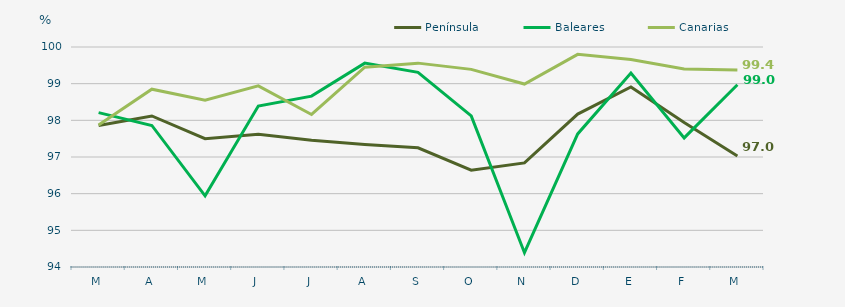
| Category | Península | Baleares | Canarias |
|---|---|---|---|
| M | 97.86 | 98.21 | 97.87 |
| A | 98.12 | 97.86 | 98.85 |
| M | 97.5 | 95.94 | 98.55 |
| J | 97.62 | 98.39 | 98.94 |
| J | 97.46 | 98.66 | 98.16 |
| A | 97.34 | 99.56 | 99.45 |
| S | 97.25 | 99.31 | 99.56 |
| O | 96.64 | 98.12 | 99.39 |
| N | 96.84 | 94.39 | 98.99 |
| D | 98.17 | 97.63 | 99.8 |
| E | 98.91 | 99.29 | 99.66 |
| F | 97.94 | 97.52 | 99.4 |
| M | 97.03 | 98.97 | 99.37 |